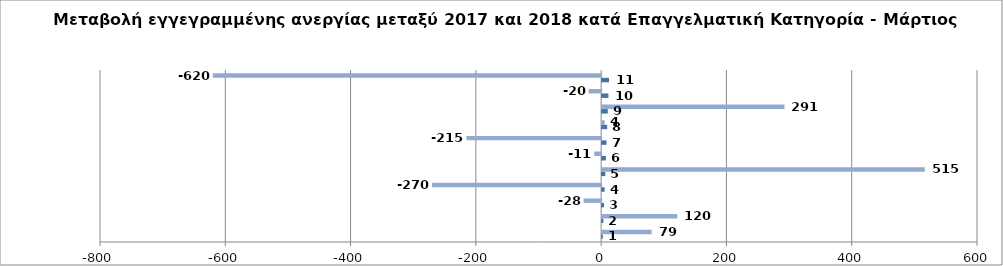
| Category | Series 0 | Series 1 |
|---|---|---|
| 0 | 1 | 79 |
| 1 | 2 | 120 |
| 2 | 3 | -28 |
| 3 | 4 | -270 |
| 4 | 5 | 515 |
| 5 | 6 | -11 |
| 6 | 7 | -215 |
| 7 | 8 | 4 |
| 8 | 9 | 291 |
| 9 | 10 | -20 |
| 10 | 11 | -620 |